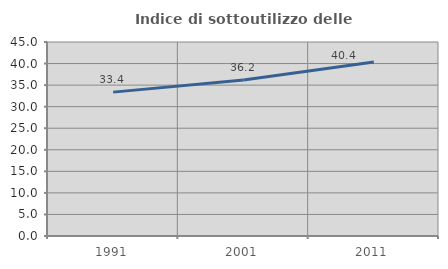
| Category | Indice di sottoutilizzo delle abitazioni  |
|---|---|
| 1991.0 | 33.372 |
| 2001.0 | 36.198 |
| 2011.0 | 40.357 |